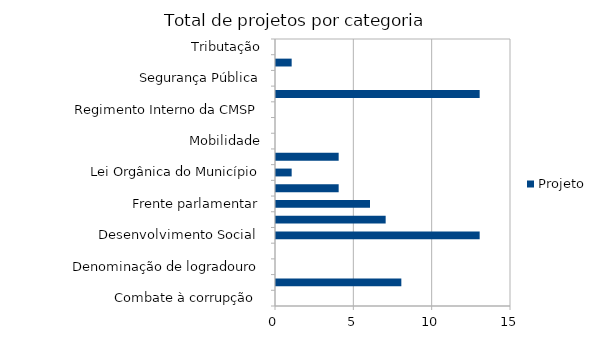
| Category | Projeto |
|---|---|
| Combate à corrupção  | 0 |
| Datas comemorativas e homenagens diversas | 8 |
| Denominação de logradouro | 0 |
| Desenvolvimento Econômico | 0 |
| Desenvolvimento Social  | 13 |
| Educação e cultura | 7 |
| Frente parlamentar | 6 |
| Habitação e Urbanismo | 4 |
| Lei Orgânica do Município | 1 |
| Meio ambiente ,  | 4 |
| Mobilidade | 0 |
| Proteção dos animais | 0 |
| Regimento Interno da CMSP | 0 |
| Saude-Esporte | 13 |
| Segurança Pública | 0 |
| Transparencia | 1 |
| Tributação | 0 |